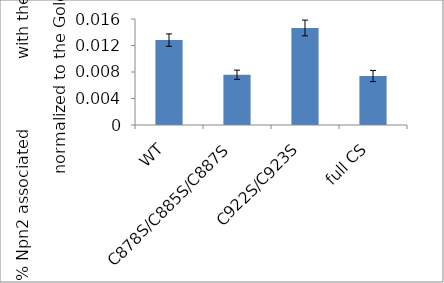
| Category | Series 0 |
|---|---|
| WT | 0.013 |
| C878S/C885S/C887S | 0.008 |
| C922S/C923S | 0.015 |
| full CS | 0.007 |